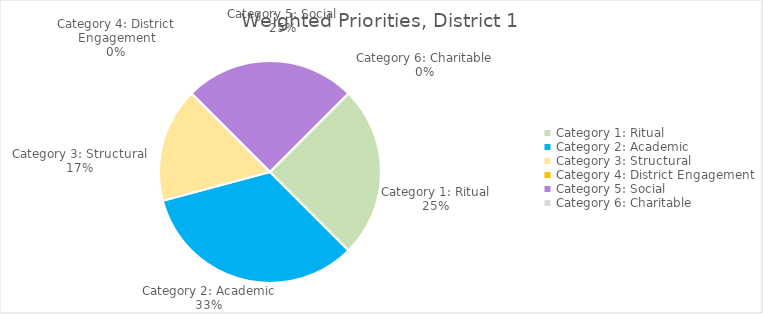
| Category | District 1 |
|---|---|
| Category 1: Ritual | 3 |
| Category 2: Academic | 4 |
| Category 3: Structural | 2 |
| Category 4: District Engagement | 0 |
| Category 5: Social | 3 |
| Category 6: Charitable | 0 |